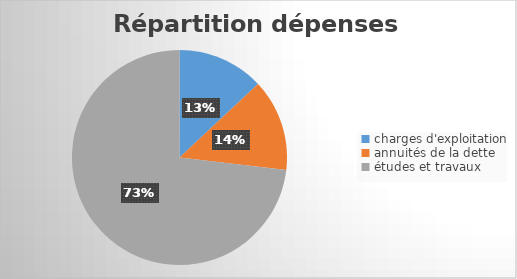
| Category | Series 0 |
|---|---|
| charges d'exploitation | 919000 |
| annuités de la dette | 975000 |
| études et travaux | 5155435 |